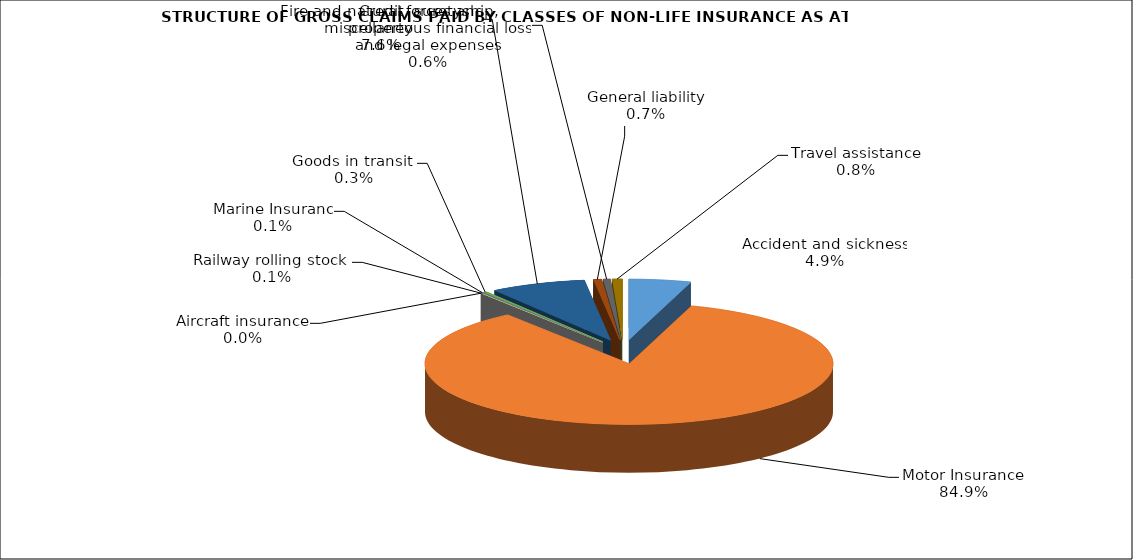
| Category | Accident and sickness | Series 1 |
|---|---|---|
| Accident and sickness | 0.049 |  |
| Motor Insurance | 0.849 |  |
| Railway rolling stock  | 0.001 |  |
| Aircraft insurance | 0 |  |
| Marine Insuranc | 0.001 |  |
| Goods in transit  | 0.003 |  |
| Fire and natural forces and property | 0.076 |  |
| General liability | 0.007 |  |
| Credit, suretyship, miscellaneous financial loss and legal expenses | 0.006 |  |
| Travel assistance | 0.008 |  |